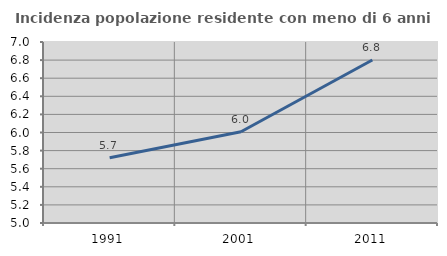
| Category | Incidenza popolazione residente con meno di 6 anni |
|---|---|
| 1991.0 | 5.72 |
| 2001.0 | 6.008 |
| 2011.0 | 6.801 |